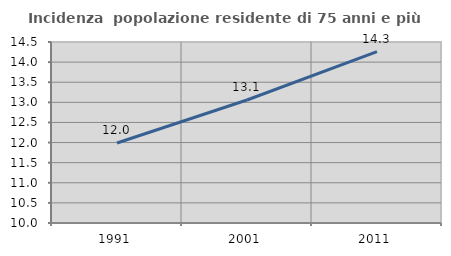
| Category | Incidenza  popolazione residente di 75 anni e più |
|---|---|
| 1991.0 | 11.988 |
| 2001.0 | 13.058 |
| 2011.0 | 14.262 |